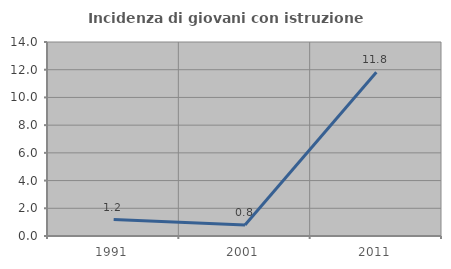
| Category | Incidenza di giovani con istruzione universitaria |
|---|---|
| 1991.0 | 1.19 |
| 2001.0 | 0.794 |
| 2011.0 | 11.818 |